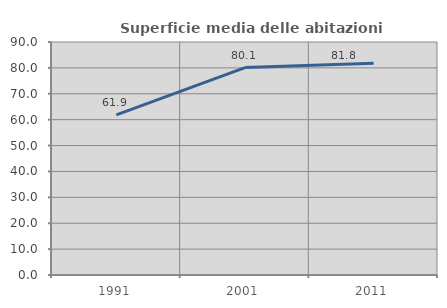
| Category | Superficie media delle abitazioni occupate |
|---|---|
| 1991.0 | 61.873 |
| 2001.0 | 80.126 |
| 2011.0 | 81.807 |